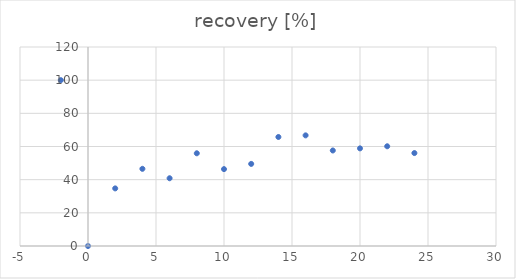
| Category | recovery [%] |
|---|---|
| -2.0 | 100 |
| 0.0 | 0 |
| 2.0 | 34.735 |
| 4.0 | 46.539 |
| 6.0 | 40.853 |
| 8.0 | 55.908 |
| 10.0 | 46.362 |
| 12.0 | 49.51 |
| 14.0 | 65.737 |
| 16.0 | 66.712 |
| 18.0 | 57.599 |
| 20.0 | 58.875 |
| 22.0 | 60.137 |
| 24.0 | 56.047 |